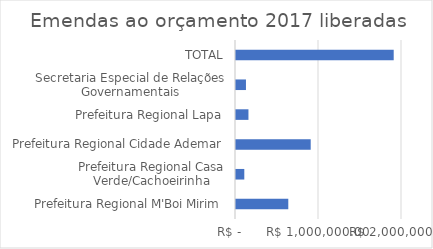
| Category | Series 0 |
|---|---|
| Prefeitura Regional M'Boi Mirim | 630000 |
| Prefeitura Regional Casa Verde/Cachoeirinha | 100000 |
| Prefeitura Regional Cidade Ademar | 900000 |
| Prefeitura Regional Lapa | 150000 |
| Secretaria Especial de Relações Governamentais | 120000 |
| TOTAL | 1900000 |